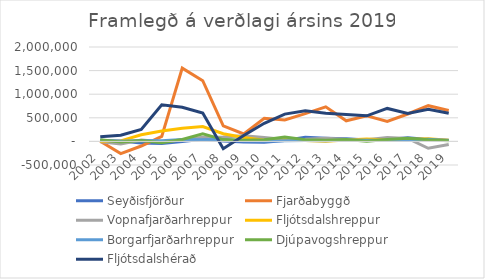
| Category | Seyðisfjörður | Fjarðabyggð | Vopnafjarðarhreppur | Fljótsdalshreppur | Borgarfjarðarhreppur | Djúpavogshreppur | Fljótsdalshérað |
|---|---|---|---|---|---|---|---|
| 2002.0 | 17880.9 | 4970.191 | -6860.59 | 2298.792 | 24505.717 | 36248.084 | 98382.844 |
| 2003.0 | 6506.386 | -258672.148 | -56139.228 | 11058.383 | 5813.691 | -10340.949 | 131628.565 |
| 2004.0 | -35510.532 | -98098.394 | 30209.32 | 139587.271 | 18937.752 | 16844.432 | 254264.437 |
| 2005.0 | -47055.81 | 105276.624 | -4768.547 | 218466.273 | 15486.261 | -26964.177 | 776332.557 |
| 2006.0 | -2571.366 | 1552950.47 | 28092.624 | 279228.778 | 39194.452 | 40512.502 | 723390.012 |
| 2007.0 | 46428.552 | 1286049.33 | 90068.104 | 314126.361 | 33716.258 | 161729.491 | 600097.344 |
| 2008.0 | 8886.191 | 329644.947 | 95034.273 | 163629.272 | 40402.853 | 38302.758 | -154669.981 |
| 2009.0 | -13901.619 | 157439.265 | 118953.145 | 82242.972 | 15364.804 | 24539.627 | 124104.209 |
| 2010.0 | -17298.978 | 490014.71 | 82644.938 | 22224.955 | 7099.961 | 37157.709 | 383984.929 |
| 2011.0 | 19841.99 | 452905.56 | 40316.721 | 35964.461 | 13828.269 | 92472.351 | 578278.702 |
| 2012.0 | 86302.367 | 587890.722 | 47308.195 | 21377.737 | 17215.418 | 37015.036 | 647730.695 |
| 2013.0 | 67299.226 | 732380.81 | 66997.197 | 5227.609 | 12510.382 | 23830.814 | 597992.416 |
| 2014.0 | 56533.569 | 436665.984 | 44792.418 | 30563.047 | 29051.865 | 38616.379 | 572041.419 |
| 2015.0 | 31605.318 | 541155.265 | 37490.19 | 51722.272 | 23985.094 | 5356.054 | 542503.037 |
| 2016.0 | 38162.965 | 422343.916 | 84387.83 | 30660.844 | 21837.858 | 42744.544 | 698401.311 |
| 2017.0 | 76564.797 | 580634.538 | 64156.946 | 37934.386 | 17221.843 | 66267.233 | 592692.261 |
| 2018.0 | 42443.95 | 756910.58 | -145757.474 | 57851.699 | 48002.65 | 32600.053 | 679622.491 |
| 2019.0 | 24592 | 655898 | -64878 | 22336 | 17052 | 12562 | 596009 |